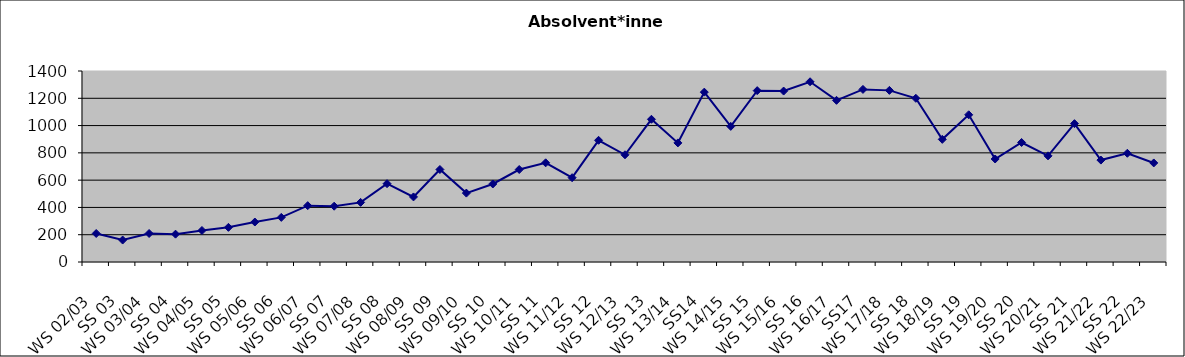
| Category | Absolvent*innen |
|---|---|
| WS 02/03 | 209 |
| SS 03 | 161 |
| WS 03/04 | 209 |
| SS 04 | 204 |
| WS 04/05 | 231 |
| SS 05 | 254 |
| WS 05/06 | 293 |
| SS 06 | 327 |
| WS 06/07 | 413 |
| SS 07 | 409 |
| WS 07/08 | 437 |
| SS 08 | 574 |
| WS 08/09 | 477 |
| SS 09 | 678 |
| WS 09/10 | 505 |
| SS 10 | 572 |
| WS 10/11 | 678 |
| SS 11 | 727 |
| WS 11/12 | 618 |
| SS 12 | 892 |
| WS 12/13 | 786 |
| SS 13 | 1046 |
| WS 13/14 | 873 |
| SS14 | 1245 |
| WS 14/15 | 994 |
| SS 15 | 1256 |
| WS 15/16 | 1253 |
| SS 16 | 1321 |
| WS 16/17 | 1185 |
| SS17 | 1265 |
| WS 17/18 | 1258 |
| SS 18 | 1200 |
| WS 18/19 | 899 |
| SS 19 | 1079 |
| WS 19/20 | 755 |
| SS 20 | 876 |
| WS 20/21 | 778 |
| SS 21 | 1014 |
| WS 21/22 | 747 |
| SS 22 | 797 |
| WS 22/23 | 726 |